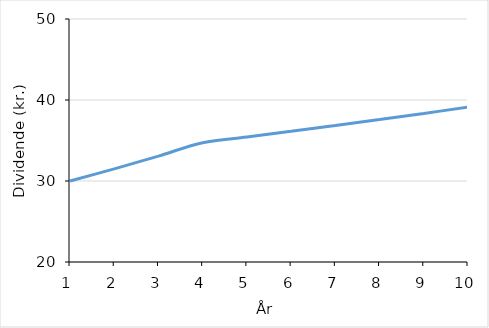
| Category | Series 0 |
|---|---|
| 1.0 | 30 |
| 2.0 | 31.5 |
| 3.0 | 33.075 |
| 4.0 | 34.729 |
| 5.0 | 35.423 |
| 6.0 | 36.132 |
| 7.0 | 36.854 |
| 8.0 | 37.592 |
| 9.0 | 38.343 |
| 10.0 | 39.11 |